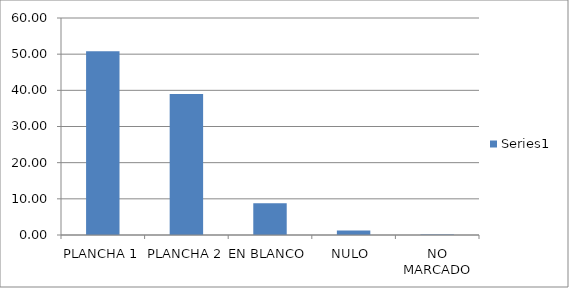
| Category | Series 0 |
|---|---|
| PLANCHA 1 | 50.799 |
| PLANCHA 2 | 38.978 |
| EN BLANCO | 8.786 |
| NULO  | 1.278 |
| NO MARCADO | 0.16 |